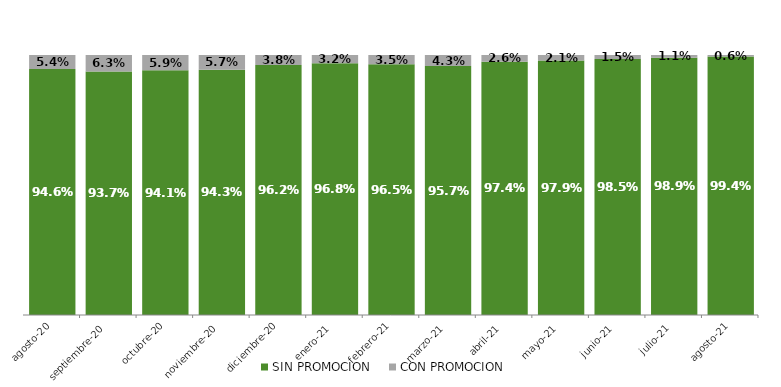
| Category | SIN PROMOCION   | CON PROMOCION   |
|---|---|---|
| 2020-08-01 | 0.946 | 0.054 |
| 2020-09-01 | 0.937 | 0.063 |
| 2020-10-01 | 0.941 | 0.059 |
| 2020-11-01 | 0.943 | 0.057 |
| 2020-12-01 | 0.962 | 0.038 |
| 2021-01-01 | 0.968 | 0.032 |
| 2021-02-01 | 0.965 | 0.035 |
| 2021-03-01 | 0.957 | 0.043 |
| 2021-04-01 | 0.974 | 0.026 |
| 2021-05-01 | 0.979 | 0.021 |
| 2021-06-01 | 0.985 | 0.015 |
| 2021-07-01 | 0.989 | 0.011 |
| 2021-08-01 | 0.994 | 0.006 |